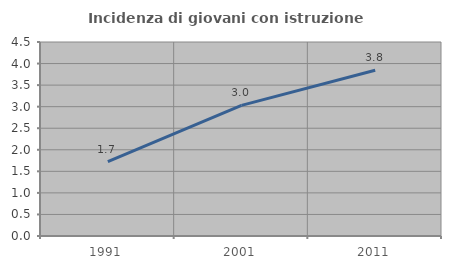
| Category | Incidenza di giovani con istruzione universitaria |
|---|---|
| 1991.0 | 1.724 |
| 2001.0 | 3.03 |
| 2011.0 | 3.846 |